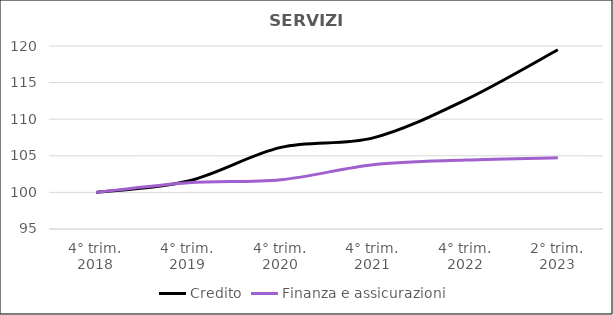
| Category | Credito | Finanza e assicurazioni  |
|---|---|---|
| 4° trim.
2018 | 100 | 100 |
| 4° trim.
2019 | 101.558 | 101.313 |
| 4° trim.
2020 | 106.147 | 101.733 |
| 4° trim.
2021 | 107.446 | 103.782 |
| 4° trim.
2022 | 112.641 | 104.412 |
| 2° trim.
2023 | 119.481 | 104.727 |